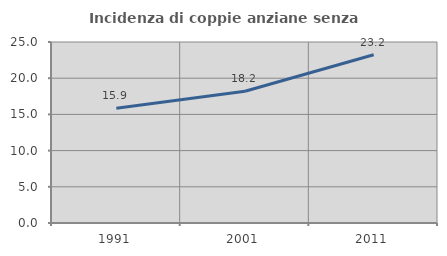
| Category | Incidenza di coppie anziane senza figli  |
|---|---|
| 1991.0 | 15.851 |
| 2001.0 | 18.2 |
| 2011.0 | 23.242 |